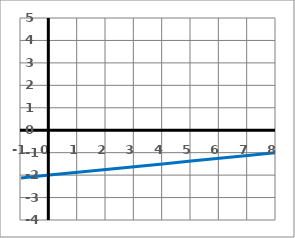
| Category | y |
|---|---|
| -1.0 | -2.125 |
| 0.0 | -2 |
| 1.0 | -1.875 |
| 2.0 | -1.75 |
| 3.0 | -1.625 |
| 4.0 | -1.5 |
| 5.0 | -1.375 |
| 6.0 | -1.25 |
| 7.0 | -1.125 |
| 8.0 | -1 |